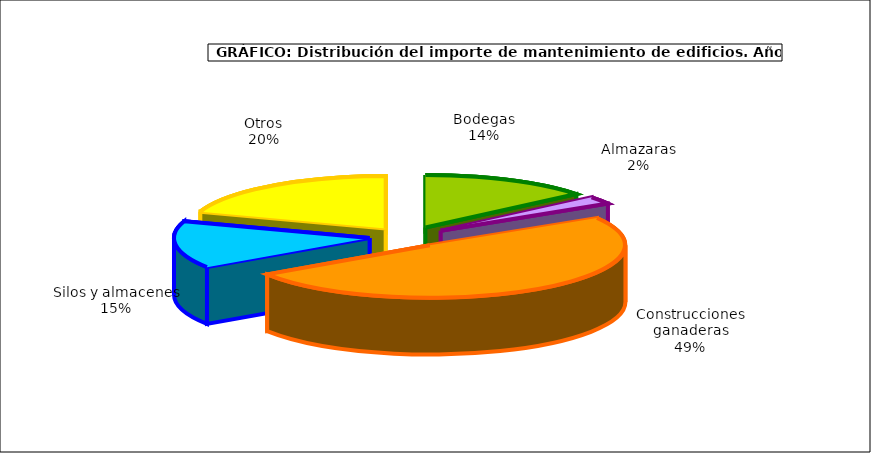
| Category | Series 0 |
|---|---|
| 0 | 93.307 |
| 1 | 15.277 |
| 2 | 328.539 |
| 3 | 96.862 |
| 4 | 132.052 |